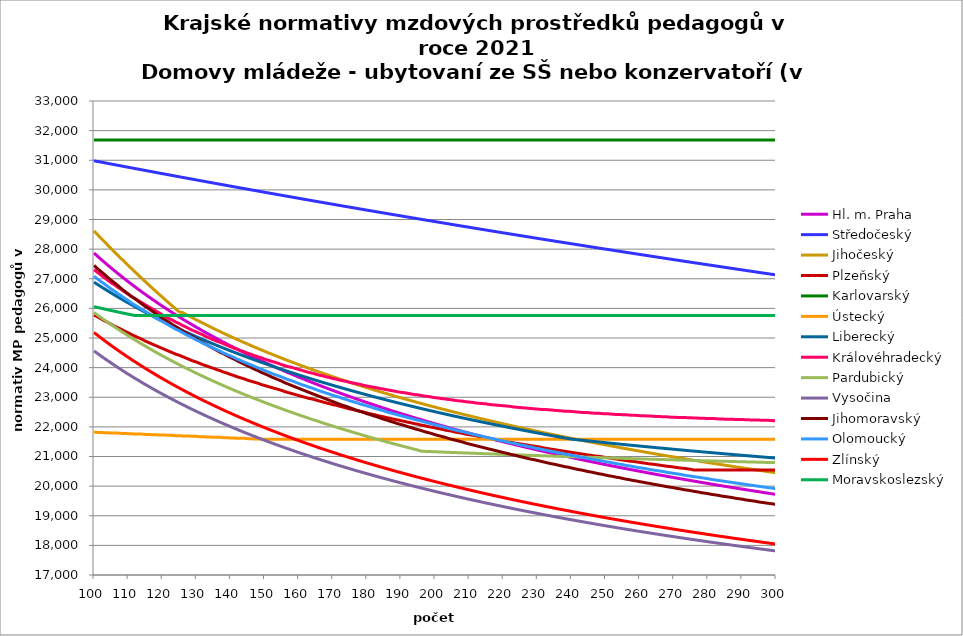
| Category | Hl. m. Praha | Středočeský | Jihočeský | Plzeňský | Karlovarský  | Ústecký   | Liberecký | Královéhradecký | Pardubický | Vysočina | Jihomoravský | Olomoucký | Zlínský | Moravskoslezský |
|---|---|---|---|---|---|---|---|---|---|---|---|---|---|---|
| 100.0 | 27868.253 | 30982.722 | 28614.05 | 25770.831 | 31680 | 21824.385 | 26885.263 | 27305.722 | 25861.002 | 24564.175 | 27452.948 | 27085.523 | 25185.836 | 26058.161 |
| 101.0 | 27764.364 | 30960.738 | 28493.567 | 25717.058 | 31680 | 21813.21 | 26810.474 | 27216.73 | 25776.902 | 24479.323 | 27342.314 | 26995.339 | 25095.861 | 26031.615 |
| 102.0 | 27662.258 | 30938.785 | 28374.095 | 25650.156 | 31680 | 21813.21 | 26736.831 | 27128.316 | 25694.168 | 24397.42 | 27248.193 | 26905.752 | 25007.403 | 26005.385 |
| 103.0 | 27561.886 | 30916.863 | 28255.62 | 25583.601 | 31680 | 21802.047 | 26664.304 | 27040.475 | 25612.763 | 24314.889 | 27154.717 | 26831.55 | 24920.421 | 25979.462 |
| 104.0 | 27463.198 | 30894.973 | 28138.131 | 25530.606 | 31680 | 21802.047 | 26592.865 | 26953.201 | 25532.652 | 24236.416 | 27046.469 | 26743.046 | 24834.874 | 25953.841 |
| 105.0 | 27366.15 | 30873.113 | 28021.614 | 25464.669 | 31680 | 21790.895 | 26522.485 | 26866.488 | 25453.799 | 24157.288 | 26954.37 | 26655.123 | 24750.722 | 25928.515 |
| 106.0 | 27270.695 | 30851.284 | 27906.059 | 25399.073 | 31680 | 21790.895 | 26453.139 | 26794.652 | 25376.172 | 24079.828 | 26862.896 | 26582.295 | 24667.928 | 25903.477 |
| 107.0 | 27176.79 | 30829.487 | 27791.452 | 25346.838 | 31680 | 21790.895 | 26384.801 | 26708.955 | 25299.74 | 24005.153 | 26772.041 | 26495.425 | 24586.456 | 25878.723 |
| 108.0 | 27084.395 | 30807.719 | 27677.784 | 25294.818 | 31680 | 21779.755 | 26317.445 | 26637.959 | 25224.472 | 23928.663 | 26666.816 | 26423.466 | 24506.271 | 25854.245 |
| 109.0 | 26993.469 | 30785.983 | 27565.041 | 25230.092 | 31680 | 21779.755 | 26251.049 | 26553.259 | 25150.337 | 23853.79 | 26577.28 | 26337.629 | 24427.338 | 25830.038 |
| 110.0 | 26903.973 | 30764.277 | 27453.213 | 25178.55 | 31680 | 21768.625 | 26185.589 | 26483.087 | 25077.308 | 23781.633 | 26488.344 | 26266.523 | 24349.627 | 25806.097 |
| 111.0 | 26815.871 | 30742.602 | 27342.288 | 25114.417 | 31680 | 21768.625 | 26121.042 | 26399.368 | 25005.358 | 23709.91 | 26400 | 26181.701 | 24273.105 | 25782.417 |
| 112.0 | 26729.126 | 30720.958 | 27232.257 | 25063.345 | 31680 | 21757.508 | 26057.388 | 26330.005 | 24934.458 | 23639.729 | 26326.829 | 26111.433 | 24197.743 | 25758.991 |
| 113.0 | 26643.705 | 30699.343 | 27123.107 | 25012.481 | 31680 | 21757.508 | 25994.604 | 26261.006 | 24864.585 | 23571.067 | 26239.558 | 26041.542 | 24123.511 | 25757.576 |
| 114.0 | 26559.573 | 30677.76 | 27014.829 | 24961.823 | 31680 | 21757.508 | 25932.672 | 26192.368 | 24795.712 | 23501.705 | 26152.863 | 25972.023 | 24050.381 | 25757.576 |
| 115.0 | 26476.699 | 30656.206 | 26907.412 | 24898.788 | 31680 | 21746.401 | 25871.571 | 26124.088 | 24727.817 | 23433.841 | 26066.74 | 25902.875 | 23978.325 | 25757.576 |
| 116.0 | 26395.051 | 30634.683 | 26800.846 | 24848.589 | 31680 | 21746.401 | 25811.283 | 26056.162 | 24660.875 | 23367.453 | 25995.402 | 25834.095 | 23907.319 | 25757.576 |
| 117.0 | 26314.599 | 30613.19 | 26695.121 | 24798.592 | 31680 | 21735.306 | 25751.789 | 25988.589 | 24594.865 | 23302.519 | 25910.311 | 25752.038 | 23837.336 | 25757.576 |
| 118.0 | 26235.315 | 30591.727 | 26590.226 | 24748.795 | 31680 | 21735.306 | 25693.071 | 25921.366 | 24529.765 | 23236.872 | 25825.775 | 25684.055 | 23768.352 | 25757.576 |
| 119.0 | 26157.171 | 30570.294 | 26486.153 | 24699.198 | 31680 | 21724.222 | 25635.113 | 25854.489 | 24465.553 | 23173.729 | 25755.748 | 25616.43 | 23700.343 | 25757.576 |
| 120.0 | 26080.138 | 30548.891 | 26382.891 | 24649.8 | 31680 | 21724.222 | 25577.897 | 25787.957 | 24402.21 | 23109.866 | 25672.216 | 25562.585 | 23633.287 | 25757.576 |
| 121.0 | 26004.192 | 30527.519 | 26280.431 | 24600.599 | 31680 | 21724.222 | 25521.408 | 25721.766 | 24339.716 | 23048.465 | 25603.019 | 25495.597 | 23567.161 | 25757.576 |
| 122.0 | 25929.306 | 30506.176 | 26178.764 | 24551.594 | 31680 | 21713.15 | 25465.63 | 25655.914 | 24278.051 | 22986.34 | 25534.194 | 25428.96 | 23501.943 | 25757.576 |
| 123.0 | 25855.457 | 30484.863 | 26077.881 | 24502.783 | 31680 | 21713.15 | 25410.547 | 25603.475 | 24217.198 | 22926.638 | 25452.09 | 25362.669 | 23437.614 | 25757.576 |
| 124.0 | 25782.62 | 30463.579 | 25977.772 | 24454.167 | 31680 | 21702.089 | 25356.145 | 25538.226 | 24157.138 | 22867.245 | 25384.073 | 25296.724 | 23374.152 | 25757.576 |
| 125.0 | 25710.772 | 30442.326 | 25878.428 | 24417.831 | 31680 | 21702.089 | 25302.41 | 25486.267 | 24097.854 | 22808.16 | 25316.418 | 25244.214 | 23311.539 | 25757.576 |
| 126.0 | 25639.892 | 30421.102 | 25858.002 | 24369.55 | 31680 | 21691.039 | 25249.328 | 25421.613 | 24039.329 | 22749.378 | 25235.707 | 25178.882 | 23249.755 | 25757.576 |
| 127.0 | 25569.956 | 30399.907 | 25795.848 | 24321.46 | 31680 | 21691.039 | 25196.885 | 25370.127 | 23981.547 | 22691.923 | 25168.839 | 25113.887 | 23188.782 | 25757.576 |
| 128.0 | 25500.946 | 30378.742 | 25734.477 | 24273.56 | 31680 | 21691.039 | 25145.068 | 25306.061 | 23924.492 | 22635.775 | 25102.326 | 25062.133 | 23128.603 | 25757.576 |
| 129.0 | 25432.839 | 30357.607 | 25673.871 | 24225.848 | 31680 | 21680 | 25093.864 | 25255.04 | 23868.149 | 22579.904 | 25036.162 | 24997.739 | 23069.2 | 25757.576 |
| 130.0 | 25365.617 | 30336.501 | 25614.015 | 24190.186 | 31680 | 21680 | 25043.262 | 25204.225 | 23812.503 | 22525.317 | 24970.347 | 24933.675 | 23010.557 | 25757.576 |
| 131.0 | 25299.261 | 30315.424 | 25554.893 | 24142.801 | 31680 | 21668.973 | 24993.248 | 25153.614 | 23757.539 | 22469.989 | 24904.877 | 24882.66 | 22952.657 | 25757.576 |
| 132.0 | 25233.752 | 30294.376 | 25496.489 | 24095.601 | 31680 | 21668.973 | 24943.813 | 25103.206 | 23703.243 | 22416.93 | 24839.749 | 24819.184 | 22895.485 | 25757.576 |
| 133.0 | 25169.071 | 30273.358 | 25438.79 | 24060.322 | 31680 | 21657.956 | 24894.943 | 25040.48 | 23649.602 | 22363.127 | 24774.961 | 24768.635 | 22839.025 | 25757.576 |
| 134.0 | 25105.202 | 30252.369 | 25381.78 | 24013.444 | 31680 | 21657.956 | 24846.628 | 24990.524 | 23596.602 | 22310.571 | 24710.51 | 24718.293 | 22783.262 | 25757.576 |
| 135.0 | 25042.128 | 30231.409 | 25325.447 | 23978.405 | 31680 | 21646.951 | 24798.858 | 24940.767 | 23544.23 | 22258.261 | 24646.393 | 24655.651 | 22728.183 | 25757.576 |
| 136.0 | 24979.832 | 30210.478 | 25269.776 | 23931.845 | 31680 | 21646.951 | 24751.621 | 24891.207 | 23492.475 | 22207.177 | 24582.609 | 24605.766 | 22673.773 | 25757.576 |
| 137.0 | 24918.298 | 30189.576 | 25214.754 | 23897.043 | 31680 | 21646.951 | 24704.908 | 24854.167 | 23441.323 | 22156.326 | 24519.153 | 24556.083 | 22620.019 | 25757.576 |
| 138.0 | 24857.51 | 30168.702 | 25160.369 | 23850.798 | 31680 | 21635.957 | 24658.709 | 24804.95 | 23390.763 | 22106.678 | 24468.624 | 24494.26 | 22566.907 | 25757.576 |
| 139.0 | 24797.455 | 30147.858 | 25106.609 | 23816.232 | 31680 | 21635.957 | 24613.014 | 24755.929 | 23340.783 | 22058.22 | 24405.755 | 24445.025 | 22514.425 | 25757.576 |
| 140.0 | 24738.116 | 30127.043 | 25053.46 | 23770.299 | 31680 | 21624.975 | 24567.814 | 24707.101 | 23291.373 | 22009.011 | 24343.209 | 24395.988 | 22462.56 | 25757.576 |
| 141.0 | 24679.48 | 30106.256 | 25000.912 | 23735.965 | 31680 | 21624.975 | 24523.1 | 24658.465 | 23242.521 | 21960.979 | 24293.402 | 24347.147 | 22411.3 | 25757.576 |
| 142.0 | 24621.532 | 30085.498 | 24948.953 | 23690.341 | 31680 | 21614.003 | 24478.862 | 24622.113 | 23194.216 | 21913.157 | 24231.429 | 24286.37 | 22360.633 | 25757.576 |
| 143.0 | 24564.26 | 30064.768 | 24897.572 | 23656.238 | 31680 | 21614.003 | 24435.093 | 24573.811 | 23146.449 | 21865.543 | 24169.771 | 24237.967 | 22310.548 | 25757.576 |
| 144.0 | 24507.65 | 30044.067 | 24846.758 | 23622.233 | 31680 | 21614.003 | 24391.783 | 24537.708 | 23099.208 | 21819.081 | 24120.67 | 24189.756 | 22261.034 | 25757.576 |
| 145.0 | 24451.689 | 30023.394 | 24796.5 | 23577.044 | 31680 | 21603.043 | 24348.924 | 24489.736 | 23052.486 | 21772.816 | 24059.574 | 24141.737 | 22212.079 | 25757.576 |
| 146.0 | 24396.366 | 30002.75 | 24746.789 | 23543.266 | 31680 | 21603.043 | 24306.509 | 24453.88 | 23006.271 | 21727.685 | 24010.92 | 24093.908 | 22163.673 | 25757.576 |
| 147.0 | 24341.667 | 29982.135 | 24697.614 | 23509.585 | 31680 | 21592.093 | 24264.529 | 24406.235 | 22960.554 | 21681.806 | 23950.378 | 24046.268 | 22115.806 | 25757.576 |
| 148.0 | 24287.581 | 29961.547 | 24648.965 | 23476 | 31680 | 21592.093 | 24222.978 | 24370.623 | 22915.327 | 21637.052 | 23902.164 | 23998.816 | 22068.468 | 25757.576 |
| 149.0 | 24234.097 | 29940.988 | 24600.833 | 23431.369 | 31680 | 21581.155 | 24181.846 | 24335.114 | 22870.58 | 21592.481 | 23842.169 | 23951.551 | 22021.649 | 25757.576 |
| 150.0 | 24181.204 | 29920.457 | 24553.209 | 23398.007 | 31680 | 21581.155 | 24141.128 | 24287.93 | 22826.306 | 21549.017 | 23794.389 | 23904.472 | 21975.339 | 25757.576 |
| 151.0 | 24128.89 | 29899.954 | 24506.084 | 23364.739 | 31680 | 21581.155 | 24100.816 | 24252.662 | 22782.495 | 21505.727 | 23746.8 | 23857.577 | 21929.53 | 25757.576 |
| 152.0 | 24077.145 | 29879.48 | 24459.448 | 23331.566 | 31680 | 21581.155 | 24060.903 | 24217.496 | 22739.139 | 21461.696 | 23687.581 | 23810.866 | 21884.211 | 25757.576 |
| 153.0 | 24025.958 | 29859.033 | 24413.294 | 23298.488 | 31680 | 21581.155 | 24021.383 | 24182.432 | 22696.231 | 21419.668 | 23640.418 | 23764.338 | 21839.375 | 25757.576 |
| 154.0 | 23975.32 | 29838.614 | 24367.612 | 23265.503 | 31680 | 21581.155 | 23982.248 | 24147.47 | 22653.762 | 21378.713 | 23593.443 | 23729.561 | 21795.012 | 25757.576 |
| 155.0 | 23925.221 | 29818.223 | 24322.396 | 23232.611 | 31680 | 21581.155 | 23943.493 | 24101.01 | 22611.726 | 21336.104 | 23546.653 | 23683.35 | 21751.115 | 25757.576 |
| 156.0 | 23875.651 | 29797.86 | 24277.635 | 23188.899 | 31680 | 21581.155 | 23905.111 | 24066.282 | 22570.114 | 21295.467 | 23488.427 | 23637.318 | 21707.674 | 25757.576 |
| 157.0 | 23826.601 | 29777.525 | 24233.324 | 23156.224 | 31680 | 21581.155 | 23867.096 | 24031.655 | 22528.919 | 21254.985 | 23442.053 | 23591.465 | 21664.683 | 25757.576 |
| 158.0 | 23778.061 | 29757.218 | 24189.454 | 23123.64 | 31680 | 21581.155 | 23829.441 | 24008.625 | 22488.135 | 21215.551 | 23395.862 | 23557.191 | 21622.133 | 25757.576 |
| 159.0 | 23730.023 | 29736.938 | 24146.018 | 23091.148 | 31680 | 21581.155 | 23792.142 | 23974.163 | 22447.753 | 21175.371 | 23349.853 | 23511.648 | 21580.017 | 25757.576 |
| 160.0 | 23682.478 | 29716.686 | 24103.008 | 23058.746 | 31680 | 21581.155 | 23755.192 | 23939.799 | 22407.769 | 21136.232 | 23304.024 | 23466.281 | 21538.327 | 25757.576 |
| 161.0 | 23635.418 | 29696.461 | 24060.418 | 23026.436 | 31680 | 21581.155 | 23718.586 | 23905.534 | 22368.174 | 21097.237 | 23258.374 | 23421.088 | 21497.056 | 25757.576 |
| 162.0 | 23588.834 | 29676.264 | 24018.241 | 22994.216 | 31680 | 21581.155 | 23682.318 | 23871.367 | 22328.963 | 21059.267 | 23212.903 | 23387.308 | 21456.197 | 25757.576 |
| 163.0 | 23542.718 | 29656.094 | 23976.469 | 22962.087 | 31680 | 21581.155 | 23646.383 | 23837.298 | 22290.129 | 21019.677 | 23167.61 | 23342.418 | 21415.743 | 25757.576 |
| 164.0 | 23497.063 | 29635.952 | 23935.096 | 22940.717 | 31680 | 21581.155 | 23610.776 | 23814.639 | 22251.667 | 20981.11 | 23122.493 | 23308.864 | 21375.688 | 25757.576 |
| 165.0 | 23451.86 | 29615.837 | 23894.117 | 22908.736 | 31680 | 21581.155 | 23575.491 | 23780.731 | 22213.569 | 20943.556 | 23077.551 | 23264.275 | 21336.024 | 25757.576 |
| 166.0 | 23407.102 | 29595.749 | 23853.523 | 22876.845 | 31680 | 21581.155 | 23540.524 | 23746.919 | 22175.831 | 20907.875 | 23032.784 | 23219.857 | 21296.745 | 25757.576 |
| 167.0 | 23362.783 | 29575.689 | 23813.31 | 22845.042 | 31680 | 21581.155 | 23505.87 | 23724.432 | 22138.446 | 20870.582 | 22988.19 | 23186.654 | 21257.845 | 25757.576 |
| 168.0 | 23318.894 | 29555.656 | 23773.472 | 22813.327 | 31680 | 21581.155 | 23471.523 | 23690.78 | 22101.409 | 20834.286 | 22943.768 | 23142.531 | 21219.319 | 25757.576 |
| 169.0 | 23275.428 | 29535.65 | 23734.001 | 22781.701 | 31680 | 21581.155 | 23437.48 | 23668.399 | 22064.715 | 20798.115 | 22899.518 | 23109.549 | 21181.158 | 25757.576 |
| 170.0 | 23232.379 | 29515.671 | 23694.893 | 22750.162 | 31680 | 21581.155 | 23403.735 | 23634.906 | 22028.357 | 20762.07 | 22855.438 | 23065.718 | 21143.359 | 25757.576 |
| 171.0 | 23189.741 | 29495.719 | 23656.142 | 22729.184 | 31680 | 21581.155 | 23370.284 | 23612.63 | 21992.332 | 20726.149 | 22811.527 | 23032.955 | 21105.915 | 25757.576 |
| 172.0 | 23147.505 | 29475.794 | 23617.742 | 22697.79 | 31680 | 21581.155 | 23337.123 | 23579.294 | 21956.633 | 20691.204 | 22767.785 | 23000.284 | 21068.821 | 25757.576 |
| 173.0 | 23105.667 | 29455.896 | 23579.689 | 22666.483 | 31680 | 21581.155 | 23304.247 | 23557.123 | 21921.255 | 20656.376 | 22724.211 | 22956.866 | 21032.071 | 25757.576 |
| 174.0 | 23064.22 | 29436.024 | 23541.976 | 22635.262 | 31680 | 21581.155 | 23271.653 | 23534.993 | 21886.195 | 20622.51 | 22691.639 | 22924.411 | 20995.659 | 25757.576 |
| 175.0 | 23023.157 | 29416.18 | 23504.598 | 22604.127 | 31680 | 21581.155 | 23239.335 | 23501.876 | 21851.446 | 20587.913 | 22648.355 | 22881.279 | 20959.581 | 25757.576 |
| 176.0 | 22982.473 | 29396.362 | 23467.551 | 22583.417 | 31680 | 21581.155 | 23207.291 | 23479.85 | 21817.005 | 20554.271 | 22605.236 | 22849.037 | 20923.831 | 25757.576 |
| 177.0 | 22942.162 | 29376.571 | 23430.83 | 22552.425 | 31680 | 21581.155 | 23175.516 | 23457.865 | 21782.866 | 20519.902 | 22562.28 | 22816.886 | 20888.404 | 25757.576 |
| 178.0 | 22902.218 | 29356.806 | 23394.429 | 22521.517 | 31680 | 21581.155 | 23144.005 | 23435.921 | 21749.026 | 20487.316 | 22530.171 | 22774.157 | 20853.296 | 25757.576 |
| 179.0 | 22862.635 | 29337.069 | 23358.344 | 22500.958 | 31680 | 21581.155 | 23112.757 | 23403.083 | 21715.479 | 20454.002 | 22487.5 | 22742.216 | 20818.501 | 25757.576 |
| 180.0 | 22823.409 | 29317.357 | 23322.571 | 22470.191 | 31680 | 21581.155 | 23081.766 | 23381.241 | 21682.221 | 20421.625 | 22444.991 | 22710.364 | 20784.015 | 25757.576 |
| 181.0 | 22784.533 | 29297.672 | 23287.104 | 22439.508 | 31680 | 21581.155 | 23051.028 | 23359.441 | 21649.249 | 20389.35 | 22413.214 | 22678.601 | 20749.834 | 25757.576 |
| 182.0 | 22746.002 | 29278.014 | 23251.939 | 22419.1 | 31680 | 21581.155 | 23020.542 | 23337.68 | 21616.557 | 20356.354 | 22370.984 | 22636.389 | 20715.951 | 25757.576 |
| 183.0 | 22707.811 | 29258.382 | 23217.072 | 22388.556 | 31680 | 21581.155 | 22990.302 | 23315.961 | 21584.143 | 20325.106 | 22339.417 | 22604.833 | 20682.364 | 25757.576 |
| 184.0 | 22669.956 | 29238.776 | 23182.499 | 22358.095 | 31680 | 21581.155 | 22960.306 | 23294.282 | 21552.001 | 20293.135 | 22297.465 | 22573.364 | 20649.068 | 25757.576 |
| 185.0 | 22632.43 | 29219.196 | 23148.215 | 22337.834 | 31680 | 21581.155 | 22930.549 | 23272.643 | 21520.128 | 20262.081 | 22255.67 | 22541.983 | 20616.059 | 25757.576 |
| 186.0 | 22595.23 | 29199.643 | 23114.216 | 22307.511 | 31680 | 21581.155 | 22901.03 | 23251.044 | 21488.521 | 20231.935 | 22224.427 | 22500.278 | 20583.332 | 25757.576 |
| 187.0 | 22558.351 | 29180.116 | 23080.499 | 22287.342 | 31680 | 21581.155 | 22871.744 | 23229.485 | 21457.175 | 20199.446 | 22182.905 | 22469.099 | 20550.884 | 25757.576 |
| 188.0 | 22521.788 | 29160.615 | 23047.059 | 22257.156 | 31680 | 21581.155 | 22842.689 | 23207.967 | 21426.087 | 20169.486 | 22151.866 | 22438.007 | 20518.709 | 25757.576 |
| 189.0 | 22485.535 | 29141.14 | 23013.892 | 22237.077 | 31680 | 21581.155 | 22813.861 | 23186.488 | 21395.253 | 20139.615 | 22110.615 | 22407.001 | 20486.806 | 25757.576 |
| 190.0 | 22449.59 | 29121.691 | 22980.995 | 22207.027 | 31680 | 21581.155 | 22785.257 | 23165.049 | 21364.669 | 20109.832 | 22079.777 | 22376.081 | 20455.169 | 25757.576 |
| 191.0 | 22413.947 | 29102.268 | 22948.364 | 22187.039 | 31680 | 21581.155 | 22756.874 | 23154.344 | 21334.333 | 20080.137 | 22049.025 | 22345.246 | 20423.795 | 25757.576 |
| 192.0 | 22378.603 | 29082.87 | 22915.995 | 22157.124 | 31680 | 21581.155 | 22728.71 | 23132.964 | 21304.241 | 20049.731 | 22008.156 | 22314.495 | 20392.68 | 25757.576 |
| 193.0 | 22343.553 | 29063.499 | 22883.884 | 22137.225 | 31680 | 21581.155 | 22700.761 | 23111.624 | 21274.388 | 20021.01 | 21977.603 | 22283.83 | 20361.82 | 25757.576 |
| 194.0 | 22308.792 | 29044.154 | 22852.029 | 22107.444 | 31680 | 21581.155 | 22673.025 | 23090.323 | 21244.774 | 19991.577 | 21936.998 | 22253.248 | 20331.213 | 25757.576 |
| 195.0 | 22274.317 | 29024.834 | 22820.425 | 22087.634 | 31680 | 21581.155 | 22645.498 | 23079.687 | 21215.393 | 19963.022 | 21906.642 | 22222.75 | 20300.854 | 25757.576 |
| 196.0 | 22240.125 | 29005.54 | 22789.07 | 22057.987 | 31680 | 21581.155 | 22618.179 | 23058.445 | 21177.871 | 19934.548 | 21876.37 | 22192.336 | 20270.74 | 25757.576 |
| 197.0 | 22206.21 | 28986.271 | 22757.959 | 22038.266 | 31680 | 21581.155 | 22591.063 | 23037.241 | 21173.178 | 19906.156 | 21836.138 | 22162.005 | 20240.868 | 25757.576 |
| 198.0 | 22172.57 | 28967.028 | 22727.09 | 22008.75 | 31680 | 21581.155 | 22564.15 | 23026.654 | 21168.51 | 19878.63 | 21806.061 | 22131.756 | 20211.235 | 25757.576 |
| 199.0 | 22139.2 | 28947.811 | 22696.46 | 21989.117 | 31680 | 21581.155 | 22537.436 | 23005.51 | 21163.868 | 19850.396 | 21776.066 | 22101.59 | 20181.836 | 25757.576 |
| 200.0 | 22106.096 | 28928.619 | 22666.065 | 21969.519 | 31680 | 21581.155 | 22510.918 | 22984.404 | 21159.252 | 19822.243 | 21736.201 | 22071.506 | 20152.67 | 25757.576 |
| 201.0 | 22073.256 | 28909.452 | 22635.903 | 21940.187 | 31680 | 21581.155 | 22484.594 | 22973.865 | 21154.66 | 19794.948 | 21706.399 | 22041.504 | 20123.733 | 25757.576 |
| 202.0 | 22040.676 | 28890.311 | 22605.97 | 21920.676 | 31680 | 21581.155 | 22458.462 | 22952.817 | 21150.093 | 19766.952 | 21676.677 | 22011.584 | 20095.022 | 25757.576 |
| 203.0 | 22008.352 | 28871.195 | 22576.263 | 21891.474 | 31680 | 21581.155 | 22432.52 | 22942.308 | 21145.551 | 19740.584 | 21647.037 | 21981.744 | 20066.534 | 25757.576 |
| 204.0 | 21976.281 | 28852.105 | 22546.779 | 21872.05 | 31680 | 21581.155 | 22406.764 | 22921.317 | 21141.032 | 19713.513 | 21607.643 | 21951.986 | 20038.266 | 25757.576 |
| 205.0 | 21944.459 | 28833.04 | 22517.516 | 21852.66 | 31680 | 21581.155 | 22381.193 | 22910.837 | 21136.538 | 19687.287 | 21578.192 | 21922.307 | 20010.215 | 25757.576 |
| 206.0 | 21912.883 | 28814 | 22488.47 | 21823.639 | 31680 | 21581.155 | 22355.804 | 22889.904 | 21132.068 | 19660.363 | 21548.82 | 21892.709 | 19982.379 | 25757.576 |
| 207.0 | 21881.551 | 28794.985 | 22459.64 | 21804.334 | 31680 | 21581.155 | 22330.595 | 22879.452 | 21127.621 | 19634.278 | 21519.529 | 21863.191 | 19954.754 | 25757.576 |
| 208.0 | 21850.458 | 28775.995 | 22431.022 | 21785.064 | 31680 | 21581.155 | 22305.564 | 22869.01 | 21123.197 | 19608.262 | 21490.317 | 21843.556 | 19927.338 | 25757.576 |
| 209.0 | 21819.602 | 28757.03 | 22402.613 | 21756.222 | 31680 | 21581.155 | 22280.709 | 22848.153 | 21118.797 | 19581.553 | 21451.491 | 21814.17 | 19900.128 | 25757.576 |
| 210.0 | 21788.98 | 28738.09 | 22374.411 | 21737.037 | 31680 | 21581.155 | 22256.028 | 22837.739 | 21114.419 | 19556.437 | 21422.463 | 21784.863 | 19873.121 | 25757.576 |
| 211.0 | 21758.588 | 28719.175 | 22346.414 | 21717.885 | 31680 | 21581.155 | 22231.517 | 22827.335 | 21110.064 | 19531.385 | 21393.514 | 21755.635 | 19846.316 | 25757.576 |
| 212.0 | 21728.424 | 28700.285 | 22318.619 | 21698.768 | 31680 | 21581.155 | 22207.177 | 22806.554 | 21105.731 | 19505.641 | 21364.642 | 21726.485 | 19819.709 | 25757.576 |
| 213.0 | 21698.485 | 28681.42 | 22291.023 | 21670.154 | 31680 | 21581.155 | 22183.004 | 22796.178 | 21101.421 | 19480.719 | 21335.849 | 21707.095 | 19793.298 | 25757.576 |
| 214.0 | 21668.768 | 28662.579 | 22263.624 | 21651.12 | 31680 | 21581.155 | 22158.996 | 22785.812 | 21097.132 | 19455.86 | 21307.133 | 21678.075 | 19767.081 | 25757.576 |
| 215.0 | 21639.271 | 28643.764 | 22236.419 | 21632.119 | 31680 | 21581.155 | 22135.151 | 22775.455 | 21092.865 | 19430.315 | 21278.495 | 21649.132 | 19741.054 | 25757.576 |
| 216.0 | 21609.989 | 28624.973 | 22209.407 | 21613.152 | 31680 | 21581.155 | 22111.468 | 22754.768 | 21088.62 | 19406.333 | 21249.933 | 21620.267 | 19715.217 | 25757.576 |
| 217.0 | 21580.922 | 28606.206 | 22182.584 | 21584.764 | 31680 | 21581.155 | 22087.945 | 22744.439 | 21084.396 | 19382.411 | 21221.448 | 21601.066 | 19689.566 | 25757.576 |
| 218.0 | 21552.066 | 28587.465 | 22155.949 | 21565.879 | 31680 | 21581.155 | 22064.58 | 22734.12 | 21080.193 | 19357.058 | 21193.039 | 21572.328 | 19664.099 | 25757.576 |
| 219.0 | 21523.418 | 28568.747 | 22129.5 | 21547.028 | 31680 | 21581.155 | 22041.37 | 22723.81 | 21076.011 | 19333.256 | 21164.706 | 21543.667 | 19638.813 | 25757.576 |
| 220.0 | 21494.977 | 28550.055 | 22103.233 | 21528.21 | 31680 | 21581.155 | 22018.315 | 22713.509 | 21071.849 | 19310.255 | 21136.449 | 21524.602 | 19613.708 | 25757.576 |
| 221.0 | 21466.739 | 28531.386 | 22077.148 | 21509.424 | 31680 | 21581.155 | 21995.412 | 22703.217 | 21067.708 | 19285.829 | 21108.267 | 21496.067 | 19588.78 | 25757.576 |
| 222.0 | 21438.702 | 28512.742 | 22051.241 | 21490.671 | 31680 | 21581.155 | 21972.66 | 22692.935 | 21063.588 | 19262.203 | 21080.16 | 21467.608 | 19564.028 | 25757.576 |
| 223.0 | 21410.864 | 28494.123 | 22025.511 | 21462.603 | 31680 | 21581.155 | 21950.057 | 22672.398 | 21059.487 | 19239.37 | 21052.128 | 21448.677 | 19539.448 | 25757.576 |
| 224.0 | 21383.222 | 28475.528 | 21999.956 | 21443.932 | 31680 | 21581.155 | 21927.601 | 22662.144 | 21055.407 | 19215.123 | 21024.17 | 21420.343 | 19515.04 | 25757.576 |
| 225.0 | 21355.774 | 28456.957 | 21974.573 | 21425.293 | 31680 | 21581.155 | 21905.291 | 22651.899 | 21051.346 | 19192.402 | 20996.286 | 21392.084 | 19490.802 | 25757.576 |
| 226.0 | 21328.518 | 28438.41 | 21949.362 | 21406.687 | 31680 | 21581.155 | 21883.125 | 22641.663 | 21047.305 | 19169.734 | 20968.477 | 21373.286 | 19466.73 | 25757.576 |
| 227.0 | 21301.451 | 28419.887 | 21924.319 | 21388.113 | 31680 | 21581.155 | 21861.101 | 22631.436 | 21043.283 | 19146.391 | 20940.741 | 21345.151 | 19442.824 | 25757.576 |
| 228.0 | 21274.571 | 28401.389 | 21899.442 | 21369.571 | 31680 | 21581.155 | 21839.218 | 22621.219 | 21039.28 | 19123.831 | 20913.078 | 21326.436 | 19419.081 | 25757.576 |
| 229.0 | 21247.876 | 28382.914 | 21874.731 | 21351.061 | 31680 | 21581.155 | 21817.474 | 22611.011 | 21035.297 | 19102.775 | 20894.677 | 21298.424 | 19395.499 | 25757.576 |
| 230.0 | 21221.364 | 28364.464 | 21850.182 | 21332.583 | 31680 | 21581.155 | 21795.868 | 22600.812 | 21031.332 | 19079.595 | 20867.135 | 21270.485 | 19372.078 | 25757.576 |
| 231.0 | 21195.032 | 28346.037 | 21825.795 | 21314.137 | 31680 | 21581.155 | 21774.398 | 22590.622 | 21027.386 | 19057.914 | 20839.667 | 21251.9 | 19348.813 | 25757.576 |
| 232.0 | 21168.879 | 28327.635 | 21801.567 | 21286.528 | 31680 | 21581.155 | 21753.063 | 22590.622 | 21023.458 | 19034.843 | 20812.27 | 21224.084 | 19325.705 | 25757.576 |
| 233.0 | 21142.903 | 28309.256 | 21777.497 | 21268.162 | 31680 | 21581.155 | 21731.861 | 22580.442 | 21019.549 | 19013.264 | 20784.945 | 21205.58 | 19302.751 | 25757.576 |
| 234.0 | 21117.101 | 28290.901 | 21753.582 | 21249.828 | 31680 | 21581.155 | 21710.791 | 22570.27 | 21015.658 | 18991.734 | 20757.692 | 21177.884 | 19279.95 | 25757.576 |
| 235.0 | 21091.472 | 28272.57 | 21729.822 | 21231.525 | 31680 | 21581.155 | 21689.851 | 22560.108 | 21011.785 | 18970.252 | 20739.563 | 21159.461 | 19257.299 | 25757.576 |
| 236.0 | 21066.013 | 28254.263 | 21706.214 | 21213.253 | 31680 | 21581.155 | 21669.04 | 22549.955 | 21007.93 | 18948.819 | 20712.429 | 21131.885 | 19234.797 | 25757.576 |
| 237.0 | 21040.723 | 28235.979 | 21682.757 | 21195.013 | 31680 | 21581.155 | 21648.357 | 22539.811 | 21004.093 | 18927.435 | 20685.366 | 21113.542 | 19212.442 | 25757.576 |
| 238.0 | 21015.6 | 28217.719 | 21659.449 | 21176.804 | 31680 | 21581.155 | 21627.801 | 22529.676 | 21000.273 | 18906.099 | 20658.373 | 21086.086 | 19190.233 | 25757.576 |
| 239.0 | 20990.641 | 28199.483 | 21636.288 | 21158.627 | 31680 | 21581.155 | 21607.369 | 22529.676 | 20996.47 | 18884.81 | 20640.417 | 21067.822 | 19168.168 | 25757.576 |
| 240.0 | 20965.846 | 28181.27 | 21613.274 | 21140.48 | 31680 | 21581.155 | 21587.061 | 22519.551 | 20992.685 | 18864.277 | 20613.542 | 21040.484 | 19146.246 | 25757.576 |
| 241.0 | 20941.212 | 28163.081 | 21590.403 | 21122.365 | 31680 | 21581.155 | 21574.772 | 22509.434 | 20988.917 | 18843.789 | 20586.736 | 21022.299 | 19124.465 | 25757.576 |
| 242.0 | 20916.737 | 28144.915 | 21567.675 | 21104.281 | 31680 | 21581.155 | 21562.547 | 22499.326 | 20985.166 | 18823.345 | 20560 | 20995.08 | 19102.823 | 25757.576 |
| 243.0 | 20892.42 | 28126.773 | 21545.089 | 21086.228 | 31680 | 21581.155 | 21550.387 | 22489.228 | 20981.431 | 18802.945 | 20542.215 | 20976.973 | 19081.319 | 25757.576 |
| 244.0 | 20868.259 | 28108.654 | 21522.642 | 21068.205 | 31680 | 21581.155 | 21538.291 | 22489.228 | 20977.714 | 18782.589 | 20515.594 | 20958.897 | 19059.951 | 25757.576 |
| 245.0 | 20844.252 | 28090.558 | 21500.334 | 21050.213 | 31680 | 21581.155 | 21526.257 | 22479.139 | 20974.013 | 18761.578 | 20489.042 | 20931.842 | 19038.718 | 25757.576 |
| 246.0 | 20820.398 | 28072.486 | 21478.162 | 21032.253 | 31680 | 21581.155 | 21514.286 | 22469.058 | 20970.328 | 18742.01 | 20471.379 | 20913.844 | 19017.619 | 25757.576 |
| 247.0 | 20796.695 | 28054.436 | 21456.126 | 21014.322 | 31680 | 21581.155 | 21502.377 | 22458.987 | 20966.659 | 18721.089 | 20444.942 | 20886.904 | 18996.651 | 25757.576 |
| 248.0 | 20773.141 | 28036.41 | 21434.223 | 21005.369 | 31680 | 21581.155 | 21490.528 | 22458.987 | 20963.007 | 18701.606 | 20418.573 | 20868.983 | 18975.815 | 25757.576 |
| 249.0 | 20749.735 | 28018.408 | 21412.453 | 20987.484 | 31680 | 21581.155 | 21478.741 | 22448.925 | 20959.37 | 18682.856 | 20401.031 | 20851.093 | 18955.107 | 25757.576 |
| 250.0 | 20726.476 | 28000.428 | 21390.815 | 20969.63 | 31680 | 21581.155 | 21467.013 | 22438.871 | 20955.749 | 18662.067 | 20374.775 | 20824.315 | 18934.527 | 25757.576 |
| 251.0 | 20703.361 | 27982.471 | 21369.306 | 20951.806 | 31680 | 21581.155 | 21455.345 | 22438.871 | 20952.144 | 18642.706 | 20348.586 | 20806.501 | 18914.074 | 25757.576 |
| 252.0 | 20680.388 | 27964.537 | 21347.925 | 20934.013 | 31680 | 21581.155 | 21443.737 | 22428.827 | 20948.555 | 18623.385 | 20331.164 | 20788.718 | 18893.746 | 25757.576 |
| 253.0 | 20657.558 | 27946.627 | 21326.672 | 20916.249 | 31680 | 21581.155 | 21432.186 | 22418.792 | 20944.981 | 18604.104 | 20305.088 | 20762.1 | 18873.542 | 25757.576 |
| 254.0 | 20634.868 | 27928.739 | 21305.545 | 20898.516 | 31680 | 21581.155 | 21420.694 | 22418.792 | 20941.422 | 18584.863 | 20287.74 | 20744.392 | 18853.461 | 25757.576 |
| 255.0 | 20612.316 | 27910.874 | 21284.542 | 20880.813 | 31680 | 21581.155 | 21409.258 | 22408.766 | 20937.879 | 18565.662 | 20261.775 | 20726.715 | 18833.501 | 25757.576 |
| 256.0 | 20589.902 | 27893.032 | 21263.662 | 20863.14 | 31680 | 21581.155 | 21397.88 | 22408.766 | 20934.35 | 18547.184 | 20235.876 | 20700.255 | 18813.661 | 25757.576 |
| 257.0 | 20567.623 | 27875.213 | 21242.905 | 20845.497 | 31680 | 21581.155 | 21386.558 | 22398.748 | 20930.837 | 18528.06 | 20218.646 | 20682.653 | 18793.94 | 25757.576 |
| 258.0 | 20545.479 | 27857.416 | 21222.268 | 20836.686 | 31680 | 21581.155 | 21375.292 | 22388.74 | 20927.338 | 18509.657 | 20192.857 | 20665.081 | 18774.336 | 25757.576 |
| 259.0 | 20523.467 | 27839.643 | 21201.751 | 20819.088 | 31680 | 21581.155 | 21364.082 | 22388.74 | 20923.854 | 18490.61 | 20175.701 | 20638.778 | 18754.849 | 25757.576 |
| 260.0 | 20501.588 | 27821.892 | 21181.353 | 20801.519 | 31680 | 21581.155 | 21352.926 | 22378.741 | 20920.385 | 18472.281 | 20150.021 | 20621.28 | 18735.478 | 25757.576 |
| 261.0 | 20479.838 | 27804.163 | 21161.072 | 20783.98 | 31680 | 21581.155 | 21341.825 | 22378.741 | 20916.93 | 18453.989 | 20132.938 | 20603.812 | 18716.22 | 25757.576 |
| 262.0 | 20458.218 | 27786.457 | 21140.907 | 20766.47 | 31680 | 21581.155 | 21330.777 | 22368.75 | 20913.489 | 18435.732 | 20107.367 | 20586.373 | 18697.075 | 25757.576 |
| 263.0 | 20436.726 | 27768.774 | 21120.857 | 20748.99 | 31680 | 21581.155 | 21319.783 | 22368.75 | 20910.063 | 18418.186 | 20090.355 | 20560.27 | 18678.043 | 25757.576 |
| 264.0 | 20415.359 | 27751.113 | 21100.921 | 20740.261 | 31680 | 21581.155 | 21308.842 | 22358.768 | 20906.651 | 18399.327 | 20064.892 | 20542.905 | 18659.121 | 25757.576 |
| 265.0 | 20394.118 | 27733.475 | 21081.098 | 20722.825 | 31680 | 21581.155 | 21297.954 | 22348.796 | 20903.252 | 18381.85 | 20047.953 | 20525.57 | 18640.308 | 25757.576 |
| 266.0 | 20373.001 | 27715.859 | 21061.386 | 20705.418 | 31680 | 21581.155 | 21287.117 | 22348.796 | 20899.868 | 18363.066 | 20022.597 | 20508.263 | 18621.604 | 25757.576 |
| 267.0 | 20352.007 | 27698.265 | 21041.785 | 20688.04 | 31680 | 21581.155 | 21276.333 | 22338.832 | 20896.497 | 18346.326 | 20005.729 | 20490.986 | 18603.008 | 25757.576 |
| 268.0 | 20331.134 | 27680.694 | 21022.293 | 20670.692 | 31680 | 21581.155 | 21265.599 | 22338.832 | 20893.14 | 18327.614 | 19980.48 | 20465.124 | 18584.518 | 25757.576 |
| 269.0 | 20310.381 | 27663.145 | 21002.91 | 20662.028 | 31680 | 21581.155 | 21254.916 | 22328.877 | 20889.797 | 18310.94 | 19963.682 | 20447.919 | 18566.133 | 25757.576 |
| 270.0 | 20289.748 | 27645.618 | 20983.634 | 20644.724 | 31680 | 21581.155 | 21244.284 | 22328.877 | 20886.467 | 18293.63 | 19946.913 | 20430.743 | 18547.853 | 25757.576 |
| 271.0 | 20269.232 | 27628.113 | 20964.465 | 20627.448 | 31680 | 21581.155 | 21233.701 | 22318.931 | 20883.151 | 18275.689 | 19921.812 | 20413.596 | 18529.676 | 25757.576 |
| 272.0 | 20248.833 | 27610.631 | 20945.401 | 20610.201 | 31680 | 21581.155 | 21223.168 | 22318.931 | 20879.848 | 18258.446 | 19905.113 | 20396.478 | 18511.601 | 25757.576 |
| 273.0 | 20228.55 | 27593.17 | 20926.442 | 20601.588 | 31680 | 21581.155 | 21212.684 | 22318.931 | 20876.558 | 18241.236 | 19880.117 | 20370.854 | 18493.628 | 25757.576 |
| 274.0 | 20208.382 | 27575.732 | 20907.586 | 20584.384 | 31680 | 21581.155 | 21202.248 | 22308.994 | 20873.281 | 18224.057 | 19863.488 | 20353.808 | 18475.755 | 25757.576 |
| 275.0 | 20188.326 | 27558.316 | 20888.832 | 20567.209 | 31680 | 21581.155 | 21191.861 | 22308.994 | 20870.017 | 18206.912 | 19846.887 | 20336.789 | 18457.982 | 25757.576 |
| 276.0 | 20168.383 | 27540.922 | 20870.18 | 20541.5 | 31680 | 21581.155 | 21181.522 | 22299.065 | 20866.765 | 18189.798 | 19822.037 | 20319.799 | 18440.307 | 25757.576 |
| 277.0 | 20148.552 | 27523.549 | 20851.629 | 20541.5 | 31680 | 21581.155 | 21171.23 | 22299.065 | 20863.527 | 18174.029 | 19805.505 | 20302.838 | 18422.729 | 25757.576 |
| 278.0 | 20128.83 | 27506.199 | 20833.177 | 20541.5 | 31680 | 21581.155 | 21160.984 | 22289.146 | 20860.301 | 18156.977 | 19780.758 | 20285.905 | 18405.248 | 25757.576 |
| 279.0 | 20109.218 | 27488.87 | 20814.823 | 20541.5 | 31680 | 21581.155 | 21150.786 | 22289.146 | 20857.088 | 18140.611 | 19764.295 | 20269 | 18387.863 | 25757.576 |
| 280.0 | 20089.714 | 27471.563 | 20796.568 | 20541.5 | 31680 | 21581.155 | 21140.634 | 22279.235 | 20853.888 | 18124.275 | 19747.859 | 20252.123 | 18370.573 | 25757.576 |
| 281.0 | 20070.317 | 27454.279 | 20778.41 | 20541.5 | 31680 | 21581.155 | 21130.528 | 22279.235 | 20850.699 | 18107.316 | 19723.256 | 20226.861 | 18353.377 | 25757.576 |
| 282.0 | 20051.026 | 27437.015 | 20760.347 | 20541.5 | 31680 | 21581.155 | 21120.467 | 22279.235 | 20847.523 | 18091.04 | 19706.888 | 20210.054 | 18336.274 | 25757.576 |
| 283.0 | 20031.841 | 27419.774 | 20742.38 | 20541.5 | 31680 | 21581.155 | 21110.451 | 22269.333 | 20844.359 | 18074.793 | 19690.547 | 20193.275 | 18319.263 | 25757.576 |
| 284.0 | 20012.759 | 27402.554 | 20724.507 | 20541.5 | 31680 | 21581.155 | 21100.481 | 22269.333 | 20841.208 | 18058.574 | 19666.087 | 20176.524 | 18302.343 | 25757.576 |
| 285.0 | 19993.781 | 27385.356 | 20706.727 | 20541.5 | 31680 | 21581.155 | 21090.554 | 22259.44 | 20838.068 | 18042.385 | 19649.814 | 20159.801 | 18285.514 | 25757.576 |
| 286.0 | 19974.905 | 27368.179 | 20689.04 | 20541.5 | 31680 | 21581.155 | 21080.672 | 22259.44 | 20834.94 | 18026.871 | 19633.568 | 20143.106 | 18268.775 | 25757.576 |
| 287.0 | 19956.13 | 27351.024 | 20671.445 | 20541.5 | 31680 | 21581.155 | 21070.833 | 22259.44 | 20831.825 | 18010.094 | 19617.348 | 20126.438 | 18252.125 | 25757.576 |
| 288.0 | 19937.456 | 27333.89 | 20653.941 | 20541.5 | 31680 | 21581.155 | 21061.038 | 22249.556 | 20828.721 | 17994.635 | 19593.069 | 20109.797 | 18235.562 | 25757.576 |
| 289.0 | 19918.881 | 27316.778 | 20636.527 | 20541.5 | 31680 | 21581.155 | 21051.286 | 22249.556 | 20825.628 | 17979.203 | 19576.917 | 20093.185 | 18219.087 | 25757.576 |
| 290.0 | 19900.404 | 27299.687 | 20619.202 | 20541.5 | 31680 | 21581.155 | 21041.576 | 22249.556 | 20822.547 | 17963.797 | 19560.791 | 20076.599 | 18202.699 | 25757.576 |
| 291.0 | 19882.026 | 27282.618 | 20601.966 | 20541.5 | 31680 | 21581.155 | 21031.909 | 22239.68 | 20819.478 | 17947.138 | 19536.652 | 20060.041 | 18186.396 | 25757.576 |
| 292.0 | 19863.744 | 27265.57 | 20584.817 | 20541.5 | 31680 | 21581.155 | 21022.284 | 22239.68 | 20816.42 | 17932.426 | 19520.592 | 20043.511 | 18170.178 | 25757.576 |
| 293.0 | 19845.558 | 27248.543 | 20567.756 | 20541.5 | 31680 | 21581.155 | 21012.7 | 22229.814 | 20813.374 | 17916.462 | 19504.559 | 20027.007 | 18154.044 | 25757.576 |
| 294.0 | 19827.467 | 27231.537 | 20550.78 | 20541.5 | 31680 | 21581.155 | 21003.158 | 22229.814 | 20810.338 | 17901.8 | 19488.551 | 20010.531 | 18137.994 | 25757.576 |
| 295.0 | 19809.47 | 27214.553 | 20533.891 | 20541.5 | 31680 | 21581.155 | 20993.656 | 22229.814 | 20807.314 | 17885.891 | 19464.59 | 19994.081 | 18122.026 | 25757.576 |
| 296.0 | 19791.567 | 27197.59 | 20517.086 | 20541.5 | 31680 | 21581.155 | 20984.196 | 22219.956 | 20804.301 | 17871.279 | 19448.649 | 19977.659 | 18106.141 | 25757.576 |
| 297.0 | 19773.756 | 27180.648 | 20500.365 | 20541.5 | 31680 | 21581.155 | 20974.776 | 22219.956 | 20801.299 | 17856.058 | 19432.733 | 19961.264 | 18090.337 | 25757.576 |
| 298.0 | 19756.037 | 27163.727 | 20483.727 | 20541.5 | 31680 | 21581.155 | 20965.396 | 22219.956 | 20798.308 | 17840.862 | 19416.844 | 19944.895 | 18074.613 | 25757.576 |
| 299.0 | 19738.409 | 27146.827 | 20467.172 | 20541.5 | 31680 | 21581.155 | 20956.055 | 22210.106 | 20795.328 | 17825.693 | 19400.98 | 19928.554 | 18058.969 | 25757.576 |
| 300.0 | 19720.871 | 27129.948 | 20450.699 | 20541.5 | 31680 | 21581.155 | 20946.754 | 22210.106 | 20792.359 | 17811.179 | 19377.234 | 19912.239 | 18043.404 | 25757.576 |